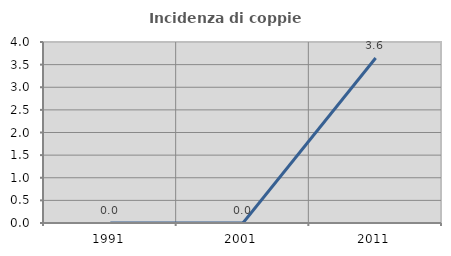
| Category | Incidenza di coppie miste |
|---|---|
| 1991.0 | 0 |
| 2001.0 | 0 |
| 2011.0 | 3.646 |